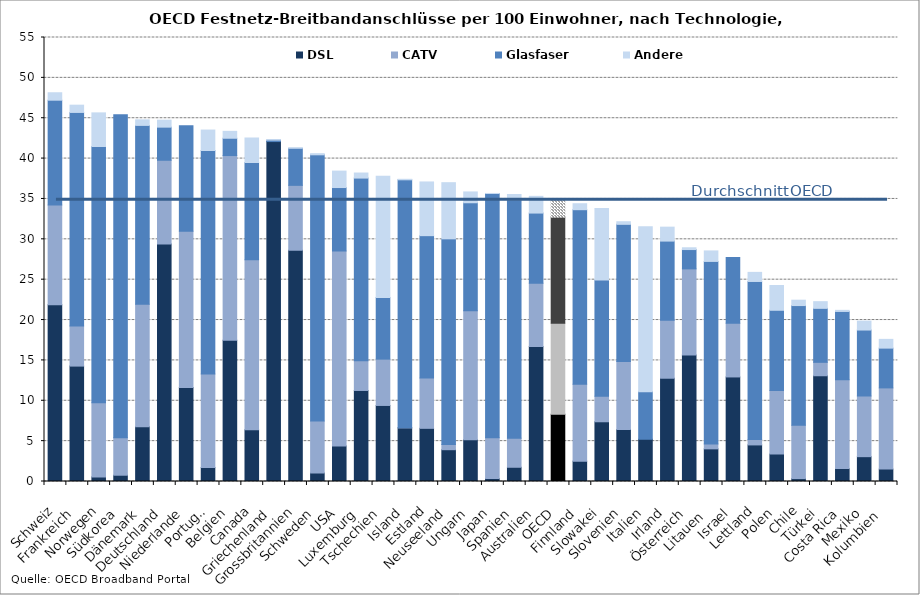
| Category | DSL | CATV | Glasfaser | Andere |
|---|---|---|---|---|
| Schweiz | 21.908 | 12.335 | 12.991 | 0.923 |
| Frankreich | 14.296 | 4.974 | 26.448 | 0.899 |
| Norwegen | 0.57 | 9.189 | 31.735 | 4.169 |
| Südkorea | 0.777 | 4.657 | 39.997 | 0 |
| Dänemark | 6.785 | 15.169 | 22.158 | 0.688 |
| Deutschland | 29.423 | 10.37 | 4.103 | 0.86 |
| Niederlande | 11.636 | 19.375 | 13.049 | 0 |
| Portugal | 1.733 | 11.573 | 27.693 | 2.536 |
| Belgien | 17.488 | 22.888 | 2.146 | 0.852 |
| Canada | 6.407 | 21.07 | 12.042 | 3.031 |
| Griechenland | 42.109 | 0 | 0.185 | 0.047 |
| Grossbritannien | 28.66 | 8.024 | 4.594 | 0.033 |
| Schweden | 1.052 | 6.43 | 32.985 | 0.144 |
| USA | 4.404 | 24.149 | 7.861 | 2.035 |
| Luxemburg | 11.277 | 3.693 | 22.616 | 0.626 |
| Tschechien | 9.421 | 5.737 | 7.643 | 15.015 |
| Island | 6.642 | 0.029 | 30.701 | 0.064 |
| Estland | 6.586 | 6.232 | 17.635 | 6.653 |
| Neuseeland | 3.939 | 0.644 | 25.478 | 6.954 |
| Ungarn | 5.166 | 15.986 | 13.376 | 1.342 |
| Japan | 0.37 | 5.063 | 30.246 | 0.001 |
| Spanien | 1.763 | 3.597 | 29.541 | 0.652 |
| Australien | 16.711 | 7.849 | 8.692 | 2.07 |
| OECD | 8.324 | 11.267 | 13.163 | 2.161 |
| Finnland | 2.519 | 9.538 | 21.613 | 0.738 |
| Slowakei | 7.399 | 3.162 | 14.397 | 8.871 |
| Slovenien | 6.437 | 8.442 | 16.977 | 0.324 |
| Italien | 5.233 | 0 | 5.889 | 20.428 |
| Irland | 12.793 | 7.196 | 9.791 | 1.727 |
| Österreich | 15.655 | 10.685 | 2.392 | 0.221 |
| Litauen  | 4.044 | 0.614 | 22.604 | 1.301 |
| Israel | 12.952 | 6.653 | 8.146 | 0 |
| Lettland | 4.531 | 0.667 | 19.581 | 1.125 |
| Polen | 3.398 | 7.871 | 9.941 | 3.067 |
| Chile | 0.36 | 6.598 | 14.836 | 0.666 |
| Türkei | 13.099 | 1.664 | 6.687 | 0.827 |
| Costa Rica | 1.597 | 10.997 | 8.47 | 0.137 |
| Mexiko | 3.076 | 7.515 | 8.171 | 1.106 |
| Kolumbien  | 1.535 | 10.059 | 4.928 | 1.084 |